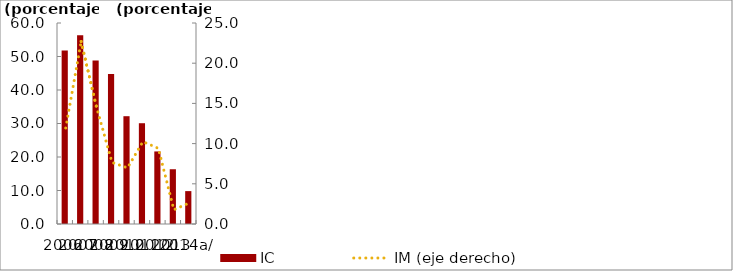
| Category | IC |
|---|---|
| 2006 | 51.804 |
| 2007 | 56.322 |
| 2008 | 48.801 |
| 2009 | 44.782 |
| 2010 | 32.178 |
| 2011 | 30.084 |
| 2012 | 21.66 |
| 2013 | 16.344 |
| 2014a/ | 9.818 |